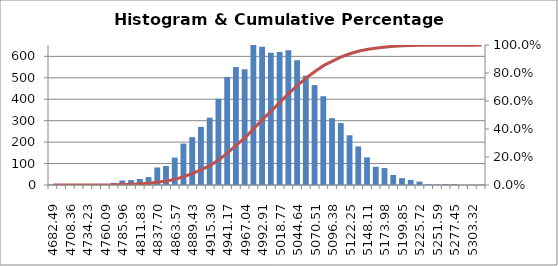
| Category | Series 0 |
|---|---|
| 4682.489232182021 | 1 |
| 4695.42326351467 | 1 |
| 4708.357294847319 | 1 |
| 4721.2913261799695 | 1 |
| 4734.225357512619 | 2 |
| 4747.159388845269 | 2 |
| 4760.093420177918 | 2 |
| 4773.027451510568 | 10 |
| 4785.961482843218 | 21 |
| 4798.895514175867 | 23 |
| 4811.829545508517 | 28 |
| 4824.7635768411665 | 37 |
| 4837.697608173816 | 82 |
| 4850.631639506466 | 89 |
| 4863.565670839115 | 128 |
| 4876.499702171765 | 193 |
| 4889.433733504415 | 223 |
| 4902.367764837065 | 271 |
| 4915.301796169714 | 314 |
| 4928.2358275023635 | 402 |
| 4941.169858835014 | 504 |
| 4954.103890167663 | 550 |
| 4967.037921500312 | 540 |
| 4979.971952832962 | 653 |
| 4992.905984165612 | 645 |
| 5005.840015498262 | 617 |
| 5018.774046830911 | 620 |
| 5031.708078163561 | 628 |
| 5044.642109496211 | 582 |
| 5057.57614082886 | 510 |
| 5070.51017216151 | 466 |
| 5083.444203494159 | 414 |
| 5096.378234826809 | 312 |
| 5109.312266159459 | 289 |
| 5122.246297492108 | 232 |
| 5135.180328824758 | 180 |
| 5148.114360157408 | 129 |
| 5161.048391490058 | 85 |
| 5173.982422822707 | 79 |
| 5186.916454155356 | 47 |
| 5199.850485488007 | 32 |
| 5212.784516820656 | 24 |
| 5225.718548153305 | 16 |
| 5238.652579485955 | 3 |
| 5251.586610818605 | 2 |
| 5264.520642151255 | 4 |
| 5277.454673483904 | 4 |
| 5290.388704816554 | 0 |
| 5303.322736149204 | 1 |
| 5322.723783148178 | 1 |